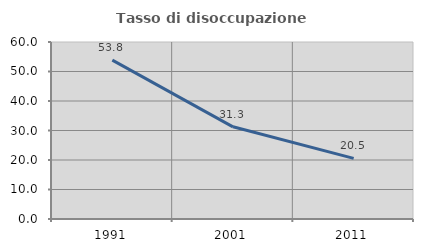
| Category | Tasso di disoccupazione giovanile  |
|---|---|
| 1991.0 | 53.846 |
| 2001.0 | 31.25 |
| 2011.0 | 20.548 |